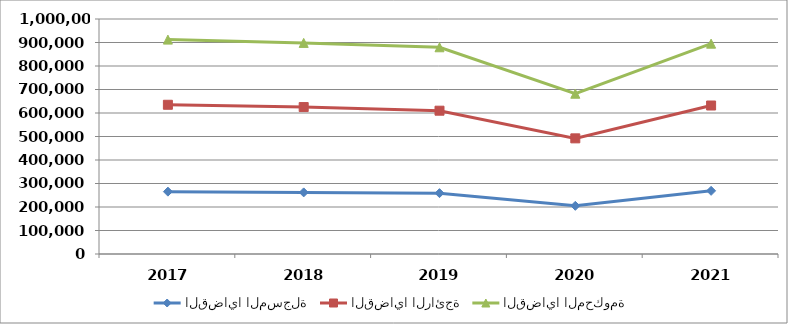
| Category | القضايا المسجلة | القضايا الرائجة | القضايا المحكومة |
|---|---|---|---|
| 2017.0 | 265350 | 369675 | 277237 |
| 2018.0 | 262140 | 363073 | 273114 |
| 2019.0 | 258943 | 350866 | 269868 |
| 2020.0 | 205022 | 287091 | 189927 |
| 2021.0 | 268757 | 363105 | 263208 |